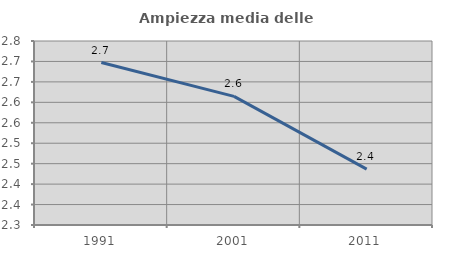
| Category | Ampiezza media delle famiglie |
|---|---|
| 1991.0 | 2.697 |
| 2001.0 | 2.615 |
| 2011.0 | 2.436 |